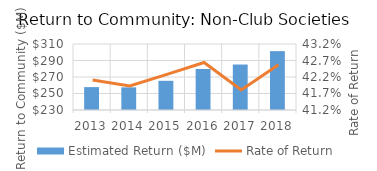
| Category | Estimated Return ($M) |
|---|---|
| 2013 | 257.76 |
| 2014 | 257.443 |
| 2015 | 265.382 |
| 2016 | 279.742 |
| 2017 | 285.129 |
| 2018 | 301.348 |